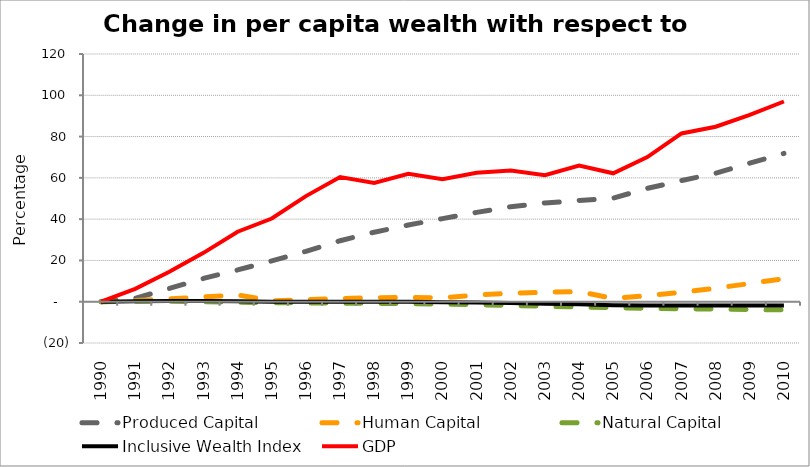
| Category | Produced Capital  | Human Capital | Natural Capital | Inclusive Wealth Index | GDP |
|---|---|---|---|---|---|
| 1990.0 | 0 | 0 | 0 | 0 | 0 |
| 1991.0 | 1.612 | 0.544 | 0.203 | 0.245 | 6.202 |
| 1992.0 | 6.417 | 1.345 | 0.177 | 0.347 | 14.493 |
| 1993.0 | 11.274 | 2.34 | -0.005 | 0.315 | 23.676 |
| 1994.0 | 15.397 | 3.273 | -0.233 | 0.222 | 33.913 |
| 1995.0 | 19.772 | 0.451 | -0.431 | -0.014 | 40.315 |
| 1996.0 | 24.405 | 1.006 | -0.572 | -0.033 | 51.167 |
| 1997.0 | 29.542 | 1.551 | -0.677 | -0.011 | 60.414 |
| 1998.0 | 33.678 | 1.924 | -0.777 | -0.009 | 57.519 |
| 1999.0 | 37.161 | 2.04 | -0.92 | -0.073 | 61.967 |
| 2000.0 | 40.257 | 1.907 | -1.14 | -0.228 | 59.388 |
| 2001.0 | 43.284 | 3.25 | -1.442 | -0.39 | 62.48 |
| 2002.0 | 46.047 | 4.137 | -1.802 | -0.634 | 63.591 |
| 2003.0 | 47.822 | 4.603 | -2.19 | -0.942 | 61.31 |
| 2004.0 | 49.057 | 4.943 | -2.563 | -1.251 | 65.992 |
| 2005.0 | 50.197 | 1.551 | -2.89 | -1.694 | 62.2 |
| 2006.0 | 54.905 | 2.912 | -3.162 | -1.798 | 70.045 |
| 2007.0 | 58.683 | 4.53 | -3.39 | -1.865 | 81.524 |
| 2008.0 | 62.228 | 6.545 | -3.587 | -1.888 | 84.783 |
| 2009.0 | 67.141 | 8.813 | -3.772 | -1.864 | 90.517 |
| 2010.0 | 71.846 | 11.187 | -3.962 | -1.843 | 96.988 |